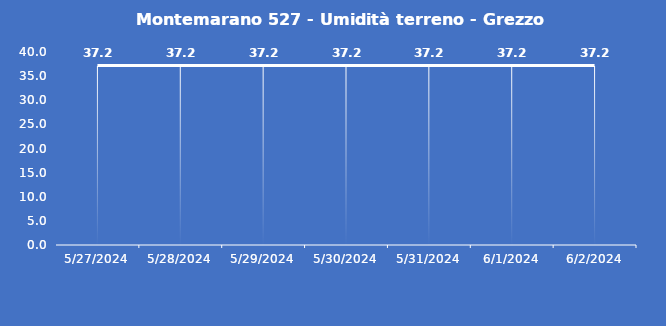
| Category | Montemarano 527 - Umidità terreno - Grezzo (%VWC) |
|---|---|
| 5/27/24 | 37.2 |
| 5/28/24 | 37.2 |
| 5/29/24 | 37.2 |
| 5/30/24 | 37.2 |
| 5/31/24 | 37.2 |
| 6/1/24 | 37.2 |
| 6/2/24 | 37.2 |